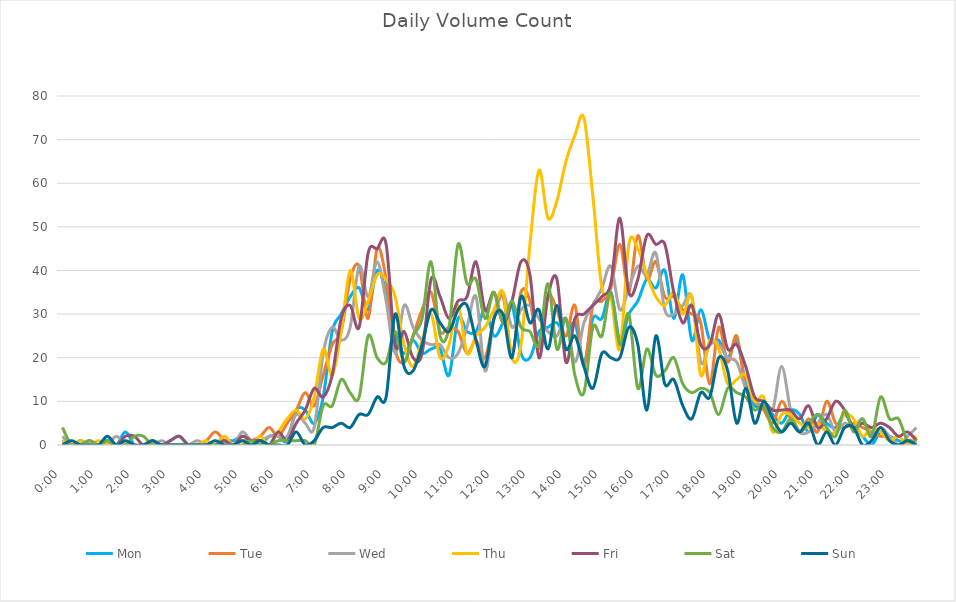
| Category | Mon | Tue | Wed | Thu | Fri | Sat | Sun |
|---|---|---|---|---|---|---|---|
| 0.0 | 1 | 1 | 2 | 1 | 0 | 4 | 0 |
| 0.010416666666666666 | 0 | 0 | 0 | 0 | 0 | 0 | 1 |
| 0.020833333333333332 | 1 | 0 | 0 | 1 | 0 | 0 | 0 |
| 0.03125 | 0 | 0 | 0 | 0 | 1 | 1 | 0 |
| 0.041666666666666664 | 0 | 0 | 0 | 1 | 0 | 0 | 0 |
| 0.05208333333333333 | 1 | 0 | 0 | 0 | 1 | 1 | 2 |
| 0.06249999999999999 | 0 | 0 | 2 | 0 | 0 | 0 | 0 |
| 0.07291666666666666 | 3 | 0 | 0 | 0 | 2 | 0 | 1 |
| 0.08333333333333333 | 0 | 0 | 0 | 0 | 2 | 2 | 0 |
| 0.09375 | 0 | 0 | 0 | 0 | 0 | 2 | 0 |
| 0.10416666666666667 | 0 | 1 | 0 | 1 | 1 | 0 | 1 |
| 0.11458333333333334 | 0 | 0 | 1 | 0 | 0 | 0 | 0 |
| 0.125 | 1 | 0 | 0 | 0 | 1 | 0 | 0 |
| 0.13541666666666666 | 2 | 0 | 0 | 0 | 2 | 0 | 0 |
| 0.14583333333333331 | 0 | 0 | 0 | 0 | 0 | 0 | 0 |
| 0.15624999999999997 | 0 | 0 | 1 | 0 | 0 | 0 | 0 |
| 0.16666666666666663 | 0 | 1 | 0 | 1 | 0 | 0 | 0 |
| 0.1770833333333333 | 0 | 3 | 0 | 0 | 0 | 0 | 1 |
| 0.18749999999999994 | 1 | 1 | 2 | 2 | 1 | 0 | 0 |
| 0.1979166666666666 | 1 | 0 | 0 | 0 | 0 | 0 | 0 |
| 0.20833333333333326 | 2 | 1 | 3 | 1 | 2 | 0 | 1 |
| 0.21874999999999992 | 1 | 1 | 1 | 0 | 1 | 1 | 0 |
| 0.22916666666666657 | 0 | 2 | 1 | 2 | 1 | 0 | 1 |
| 0.23958333333333323 | 2 | 4 | 2 | 0 | 0 | 0 | 0 |
| 0.2499999999999999 | 2 | 2 | 2 | 3 | 3 | 1 | 0 |
| 0.2604166666666666 | 1 | 5 | 2 | 6 | 1 | 1 | 0 |
| 0.27083333333333326 | 8 | 8 | 7 | 8 | 5 | 1 | 3 |
| 0.28124999999999994 | 8 | 12 | 5 | 6 | 8 | 1 | 0 |
| 0.29166666666666663 | 5 | 9 | 4 | 11 | 13 | 0 | 1 |
| 0.3020833333333333 | 11 | 16 | 21 | 22 | 11 | 9 | 4 |
| 0.3125 | 26 | 23 | 27 | 16 | 16 | 9 | 4 |
| 0.3229166666666667 | 30 | 26 | 24 | 26 | 29 | 15 | 5 |
| 0.33333333333333337 | 34 | 38 | 27 | 40 | 32 | 12 | 4 |
| 0.34375000000000006 | 36 | 41 | 41 | 29 | 27 | 11 | 7 |
| 0.35416666666666674 | 31 | 29 | 34 | 33 | 44 | 25 | 7 |
| 0.3645833333333334 | 40 | 45 | 42 | 39 | 45 | 20 | 11 |
| 0.3750000000000001 | 35 | 38 | 33 | 38 | 46 | 19 | 11 |
| 0.3854166666666668 | 25 | 22 | 21 | 34 | 23 | 26 | 30 |
| 0.3958333333333335 | 21 | 19 | 32 | 23 | 26 | 19 | 18 |
| 0.40625000000000017 | 24 | 25 | 27 | 18 | 20 | 25 | 17 |
| 0.41666666666666685 | 21 | 31 | 24 | 24 | 21 | 29 | 23 |
| 0.4270833333333333 | 22 | 35 | 23 | 30 | 38 | 42 | 31 |
| 0.4375000000000002 | 22 | 26 | 23 | 20 | 34 | 25 | 28 |
| 0.4479166666666669 | 16 | 27 | 20 | 23 | 29 | 27 | 26 |
| 0.4583333333333333 | 29 | 26 | 21 | 32 | 33 | 46 | 31 |
| 0.4687500000000003 | 26 | 21 | 27 | 21 | 34 | 37 | 32 |
| 0.47916666666666696 | 26 | 24 | 34 | 25 | 42 | 38 | 24 |
| 0.4895833333333333 | 31 | 20 | 17 | 27 | 31 | 29 | 18 |
| 0.5000000000000003 | 25 | 29 | 29 | 31 | 35 | 35 | 29 |
| 0.510416666666667 | 28 | 34 | 35 | 35 | 28 | 28 | 30 |
| 0.5208333333333334 | 32 | 21 | 27 | 20 | 33 | 33 | 20 |
| 0.5312500000000002 | 21 | 35 | 31 | 23 | 42 | 27 | 34 |
| 0.5416666666666669 | 20 | 33 | 32 | 46 | 39 | 26 | 28 |
| 0.5520833333333335 | 26 | 22 | 29 | 63 | 20 | 23 | 31 |
| 0.5625000000000001 | 27 | 34 | 26 | 52 | 34 | 37 | 22 |
| 0.5729166666666667 | 28 | 31 | 25 | 56 | 38 | 22 | 32 |
| 0.5833333333333334 | 25 | 25 | 29 | 65 | 19 | 29 | 22 |
| 0.59375 | 28 | 32 | 19 | 71 | 29 | 16 | 25 |
| 0.6041666666666666 | 19 | 18 | 28 | 75 | 30 | 12 | 18 |
| 0.6145833333333333 | 29 | 32 | 32 | 57 | 32 | 27 | 13 |
| 0.6249999999999999 | 29 | 33 | 36 | 36 | 34 | 25 | 21 |
| 0.6354166666666665 | 35 | 36 | 41 | 34 | 37 | 35 | 20 |
| 0.6458333333333331 | 24 | 46 | 31 | 22 | 52 | 23 | 20 |
| 0.6562499999999998 | 30 | 35 | 36 | 46 | 35 | 30 | 27 |
| 0.6666666666666666 | 33 | 48 | 41 | 45 | 38 | 13 | 23 |
| 0.677083333333333 | 38 | 38 | 39 | 39 | 48 | 22 | 8 |
| 0.6874999999999997 | 36 | 42 | 44 | 34 | 46 | 16 | 25 |
| 0.6979166666666666 | 40 | 34 | 31 | 32 | 46 | 17 | 14 |
| 0.7083333333333329 | 29 | 34 | 30 | 35 | 35 | 20 | 15 |
| 0.7187499999999996 | 39 | 31 | 32 | 30 | 28 | 14 | 9 |
| 0.7291666666666666 | 24 | 30 | 34 | 34 | 32 | 12 | 6 |
| 0.7395833333333328 | 31 | 28 | 19 | 16 | 23 | 13 | 12 |
| 0.75 | 24 | 14 | 23 | 24 | 23 | 12 | 11 |
| 0.7604166666666666 | 24 | 27 | 23 | 22 | 30 | 7 | 20 |
| 0.7708333333333327 | 20 | 19 | 20 | 14 | 22 | 13 | 17 |
| 0.78125 | 24 | 25 | 19 | 15 | 23 | 12 | 5 |
| 0.7916666666666666 | 14 | 13 | 13 | 16 | 18 | 11 | 13 |
| 0.8020833333333326 | 9 | 10 | 10 | 10 | 11 | 8 | 5 |
| 0.8125 | 9 | 8 | 9 | 11 | 10 | 9 | 10 |
| 0.8229166666666666 | 7 | 5 | 8 | 3 | 8 | 4 | 6 |
| 0.8333333333333334 | 5 | 10 | 18 | 7 | 8 | 3 | 3 |
| 0.84375 | 8 | 6 | 8 | 7 | 8 | 6 | 5 |
| 0.8541666666666666 | 7 | 3 | 3 | 5 | 6 | 3 | 3 |
| 0.8645833333333334 | 3 | 6 | 3 | 4 | 9 | 5 | 5 |
| 0.875 | 7 | 3 | 5 | 5 | 4 | 7 | 0 |
| 0.8854166666666666 | 5 | 10 | 7 | 3 | 6 | 4 | 3 |
| 0.8958333333333334 | 4 | 5 | 3 | 3 | 10 | 2 | 0 |
| 0.90625 | 7 | 4 | 5 | 7 | 8 | 8 | 4 |
| 0.9166666666666666 | 4 | 5 | 4 | 6 | 4 | 3 | 4 |
| 0.9270833333333334 | 2 | 4 | 6 | 2 | 5 | 6 | 0 |
| 0.9375 | 0 | 3 | 2 | 4 | 4 | 2 | 1 |
| 0.9479166666666666 | 3 | 2 | 4 | 3 | 5 | 11 | 4 |
| 0.9583333333333334 | 2 | 2 | 2 | 1 | 4 | 6 | 1 |
| 0.96875 | 1 | 0 | 0 | 2 | 2 | 6 | 0 |
| 0.9791666666666666 | 0 | 1 | 2 | 0 | 3 | 1 | 1 |
| 0.9895833333333334 | 0 | 1 | 4 | 2 | 1 | 1 | 0 |